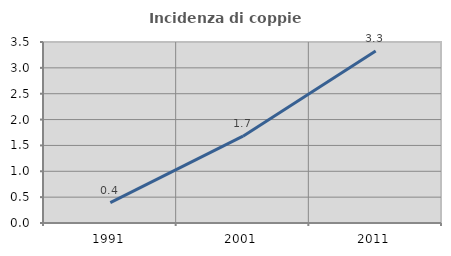
| Category | Incidenza di coppie miste |
|---|---|
| 1991.0 | 0.395 |
| 2001.0 | 1.679 |
| 2011.0 | 3.326 |